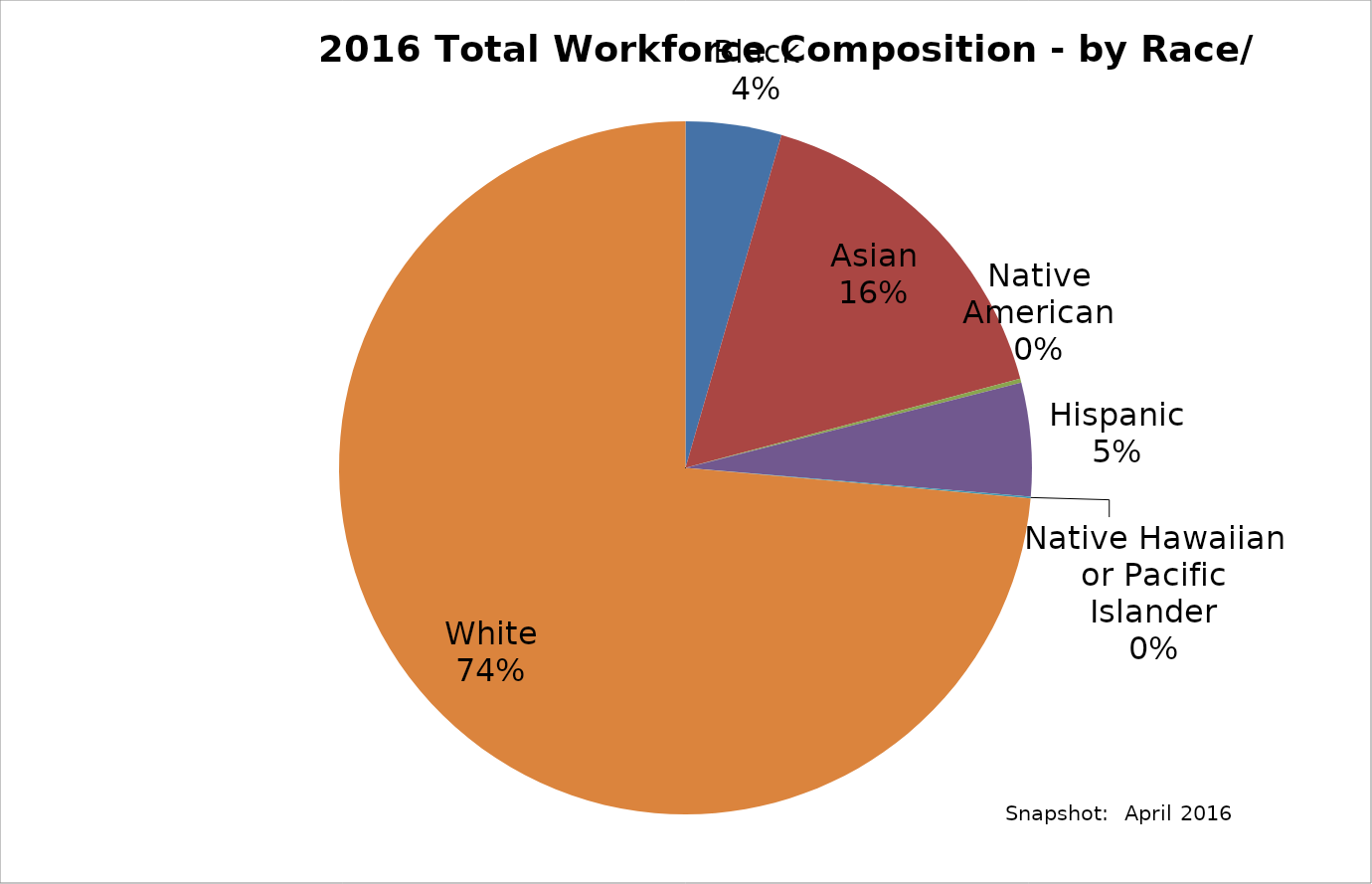
| Category | Percent Total Workforce Composition - by Race/ Ethnicity |
|---|---|
| Black | 0.045 |
| Asian | 0.164 |
| Native American | 0.002 |
| Hispanic | 0.053 |
| Native Hawaiian or Pacific Islander | 0.001 |
| White | 0.736 |